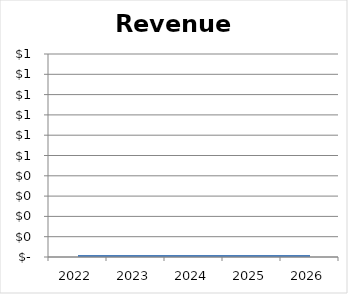
| Category | Revenues |
|---|---|
| 2022 | 0 |
| 2023 | 0 |
| 2024 | 0 |
| 2025 | 0 |
| 2026 | 0 |